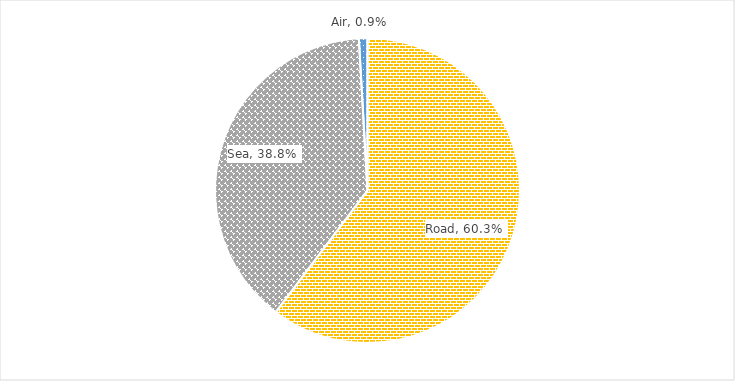
| Category | %Share |
|---|---|
| Road | 0.603 |
| Sea | 0.388 |
| Air | 0.009 |